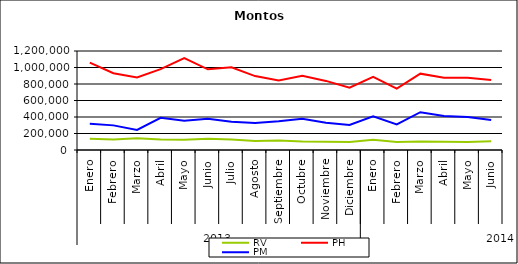
| Category | RV | PH | PM |
|---|---|---|---|
| 0 | 136808.804 | 1058774.967 | 316751.291 |
| 1 | 127193.421 | 930111.334 | 298480.292 |
| 2 | 142052.509 | 880100.908 | 242691.68 |
| 3 | 126637.277 | 980038.371 | 389833.89 |
| 4 | 123189.846 | 1112542.201 | 355777.139 |
| 5 | 135184.022 | 977877.296 | 379782.022 |
| 6 | 127790.361 | 1003315.643 | 342842.568 |
| 7 | 110532.346 | 895717.973 | 326616.455 |
| 8 | 114630.859 | 843607.598 | 348985.725 |
| 9 | 102262.08 | 901170.281 | 379642.157 |
| 10 | 99242.352 | 837424.505 | 330278.777 |
| 11 | 96243.301 | 754952.55 | 304473.582 |
| 12 | 124770.971 | 885857.327 | 408057.686 |
| 13 | 96987.292 | 744736.746 | 309218.036 |
| 14 | 103624.997 | 925209.281 | 458118.752 |
| 15 | 100007.683 | 874534.649 | 410841.727 |
| 16 | 96199.147 | 875356.86 | 399197.561 |
| 17 | 104965.63 | 848001.408 | 363776.247 |